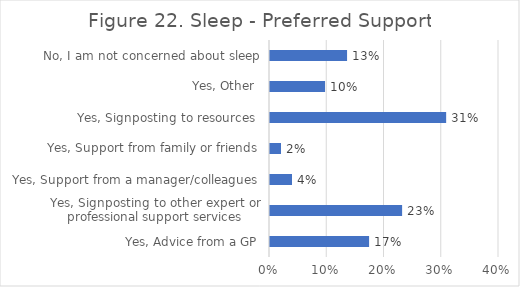
| Category | Series 0 |
|---|---|
| Yes, Advice from a GP | 0.173 |
| Yes, Signposting to other expert or professional support services | 0.231 |
| Yes, Support from a manager/colleagues | 0.038 |
| Yes, Support from family or friends | 0.019 |
| Yes, Signposting to resources  | 0.308 |
| Yes, Other  | 0.096 |
| No, I am not concerned about sleep | 0.135 |